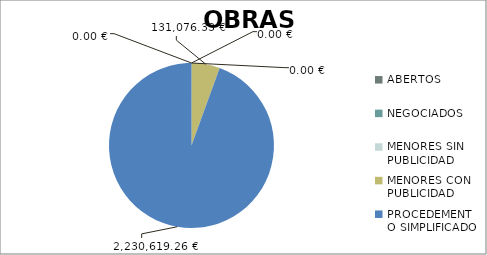
| Category | Series 0 |
|---|---|
| ABERTOS  | 0 |
| NEGOCIADOS  | 0 |
| MENORES SIN PUBLICIDAD | 0 |
| MENORES CON PUBLICIDAD | 131076.33 |
| PROCEDEMENTO SIMPLIFICADO | 2230619.26 |